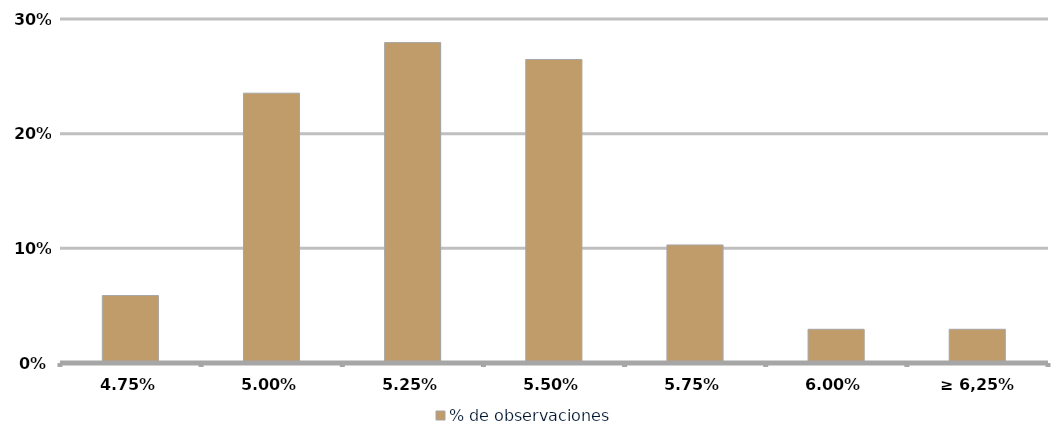
| Category | % de observaciones  |
|---|---|
| 4,75% | 0.059 |
| 5,00% | 0.235 |
| 5,25% | 0.279 |
| 5,50% | 0.265 |
| 5,75% | 0.103 |
| 6,00% | 0.029 |
| ≥ 6,25% | 0.029 |